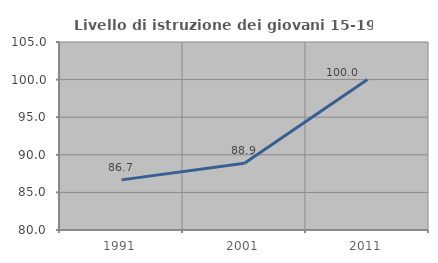
| Category | Livello di istruzione dei giovani 15-19 anni |
|---|---|
| 1991.0 | 86.667 |
| 2001.0 | 88.889 |
| 2011.0 | 100 |